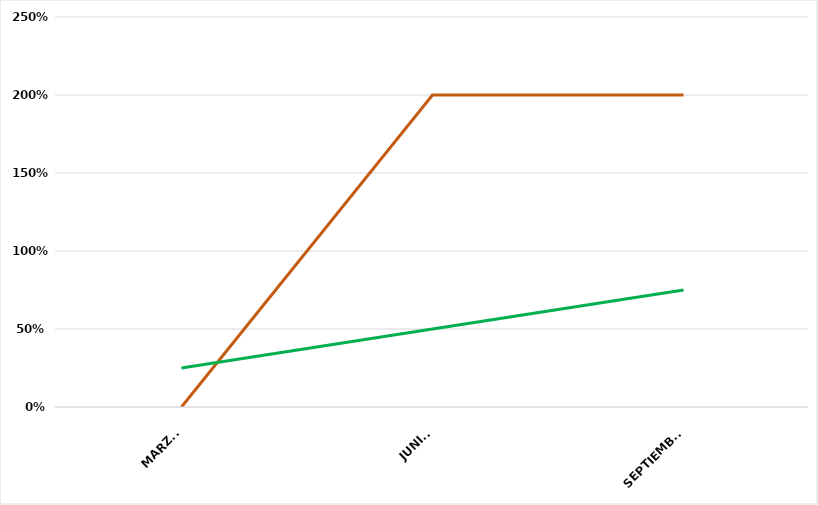
| Category | VALOR  | META PONDERADA |
|---|---|---|
| MARZO | 0 | 0.25 |
| JUNIO | 2 | 0.5 |
| SEPTIEMBRE | 2 | 0.75 |